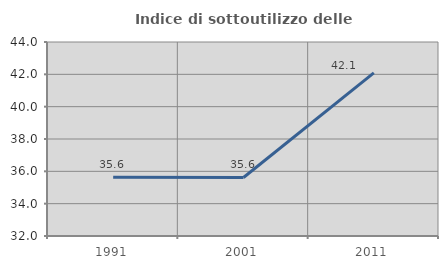
| Category | Indice di sottoutilizzo delle abitazioni  |
|---|---|
| 1991.0 | 35.632 |
| 2001.0 | 35.621 |
| 2011.0 | 42.089 |